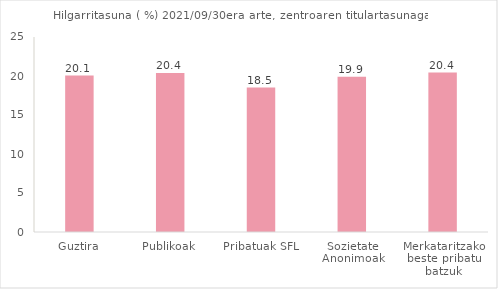
| Category | Series 0 |
|---|---|
| Guztira | 20.055 |
| Publikoak | 20.397 |
| Pribatuak SFL | 18.521 |
| Sozietate Anonimoak | 19.89 |
| Merkataritzako beste pribatu batzuk | 20.449 |